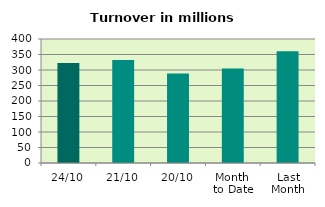
| Category | Series 0 |
|---|---|
| 24/10 | 322.892 |
| 21/10 | 332.227 |
| 20/10 | 288.45 |
| Month 
to Date | 304.564 |
| Last
Month | 360.198 |